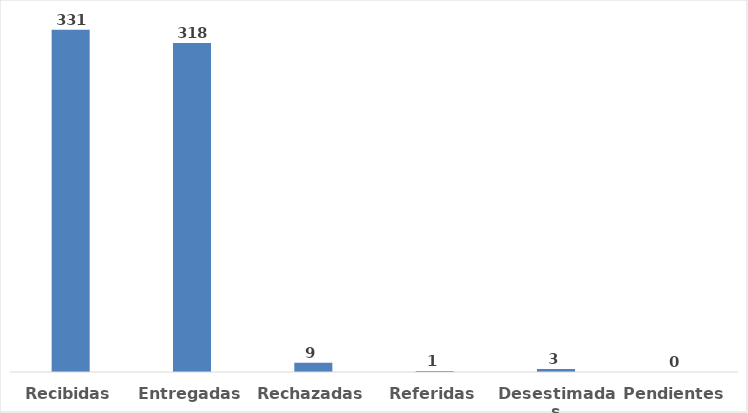
| Category | Series 0 |
|---|---|
| Recibidas | 331 |
| Entregadas | 318 |
| Rechazadas | 9 |
| Referidas | 1 |
| Desestimadas | 3 |
| Pendientes | 0 |